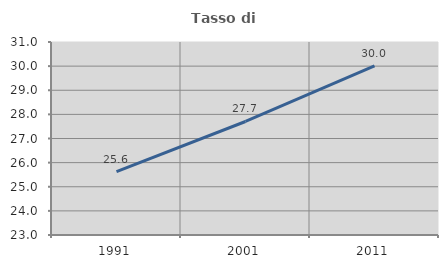
| Category | Tasso di occupazione   |
|---|---|
| 1991.0 | 25.623 |
| 2001.0 | 27.705 |
| 2011.0 | 30.007 |